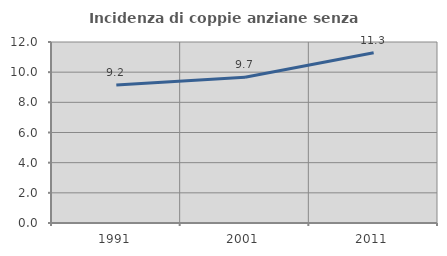
| Category | Incidenza di coppie anziane senza figli  |
|---|---|
| 1991.0 | 9.155 |
| 2001.0 | 9.659 |
| 2011.0 | 11.29 |